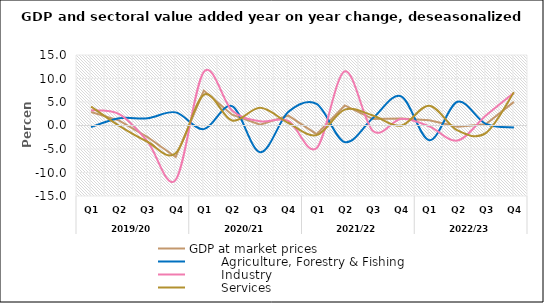
| Category | GDP at market prices |         Agriculture, Forestry & Fishing |         Industry |         Services |
|---|---|---|---|---|
| 0 | 2.878 | -0.322 | 3.255 | 4.022 |
| 1 | 1.05 | 1.533 | 2.418 | -0.089 |
| 2 | -2.454 | 1.536 | -3.367 | -3.459 |
| 3 | -6.708 | 2.796 | -11.584 | -5.893 |
| 4 | 7.424 | -0.772 | 11.427 | 6.539 |
| 5 | 2.289 | 4.113 | 3.187 | 1.063 |
| 6 | 0.189 | -5.67 | 0.899 | 3.767 |
| 7 | 2.098 | 2.901 | 0.976 | 0.535 |
| 8 | -1.835 | 4.606 | -4.815 | -2.043 |
| 9 | 4.264 | -3.54 | 11.537 | 3.374 |
| 10 | 1.367 | 1.595 | -1.163 | 2.118 |
| 11 | 1.506 | 6.2 | 1.407 | -0.036 |
| 12 | 1.128 | -3.133 | -0.196 | 4.22 |
| 13 | -0.247 | 5.039 | -3.196 | -1.055 |
| 14 | 0.256 | 0.362 | 2.094 | -1.624 |
| 15 | 5.029 | -0.433 | 6.939 | 7.062 |